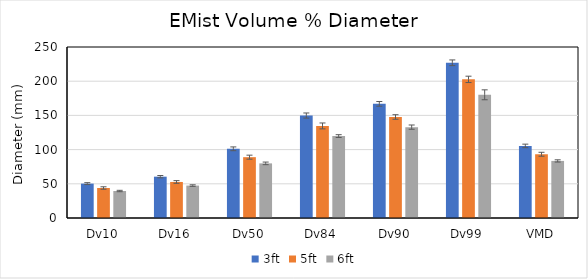
| Category | 3ft | 5ft | 6ft |
|---|---|---|---|
| Dv10 | 50.263 | 43.85 | 39.452 |
| Dv16 | 60.424 | 52.678 | 47.384 |
| Dv50 | 101.167 | 88.93 | 79.861 |
| Dv84 | 149.794 | 134.612 | 119.752 |
| Dv90 | 166.887 | 147.695 | 132.854 |
| Dv99 | 226.917 | 202.678 | 180.105 |
| VMD | 105.376 | 93.199 | 83.451 |